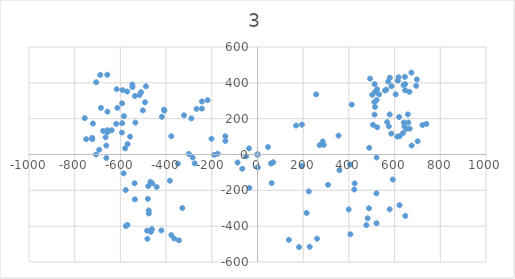
| Category | Series 0 |
|---|---|
| 0.0 | 0 |
| -243.16000000000008 | 296.004 |
| -243.16000000000008 | 256.11 |
| -289.60400000000004 | 201.331 |
| -283.947 | -16.747 |
| -468.68000000000006 | -152.506 |
| -328.75300000000004 | -298.982 |
| -466.29900000000004 | -431.764 |
| -420.45000000000005 | -424.023 |
| -343.639 | -478.803 |
| 137.173 | -476.421 |
| 228.2739999999999 | -515.125 |
| 476.27199999999993 | -393.954 |
| 520.9299999999998 | -383.832 |
| 224.404 | -206.095 |
| 168.731 | 161.585 |
| 194.18599999999992 | 166.498 |
| 489.07399999999984 | 37.438 |
| 354.50599999999986 | 105.317 |
| -66.61400000000003 | -79.565 |
| -50.09100000000001 | -9.453 |
| -383.533 | -146.254 |
| -537.751 | -160.544 |
| 308.9559999999999 | -169.178 |
| 398.866 | -306.723 |
| -476.27200000000005 | -312.231 |
| 621.558 | -282.757 |
| 647.0129999999999 | -342.598 |
| -661.6010000000001 | -19.129 |
| -706.854 | -0.075 |
| -692.5630000000001 | 26.124 |
| -661.6010000000001 | 49.942 |
| -656.837 | 123.775 |
| -723.5260000000001 | 92.813 |
| -749.725 | 85.668 |
| -592.53 | 285.733 |
| -616.3480000000001 | 364.33 |
| 514.9759999999999 | 350.04 |
| 557.847 | 357.185 |
| 586.4279999999999 | 381.003 |
| 512.594 | 392.911 |
| 572.137 | 407.202 |
| 579.2819999999999 | 428.637 |
| 617.3899999999999 | 431.019 |
| 645.971 | 392.911 |
| 665.0249999999999 | 350.04 |
| 657.8799999999999 | 223.808 |
| 619.7719999999999 | 209.518 |
| 567.374 | 180.937 |
| 660.261 | 178.555 |
| 650.7339999999999 | 142.829 |
| 636.444 | 119.012 |
| 674.5519999999999 | 49.942 |
| 700.751 | 73.759 |
| 722.1859999999999 | 164.265 |
| 622.154 | 102.34 |
| -409.13700000000006 | 250.007 |
| 412.5609999999999 | 278.588 |
| 0.0 | 0 |
| -36.990999999999985 | 34.312 |
| -201.18200000000002 | 87.752 |
| -140.44799999999987 | 75.844 |
| -348.2539999999999 | -50.984 |
| -536.56 | -250.454 |
| -575.858 | -399.312 |
| -482.971 | -424.916 |
| -376.98299999999995 | -449.924 |
| 215.02600000000007 | -326.521 |
| 59.319999999999936 | -50.239 |
| 2.1590000000001055 | -71.675 |
| -87.15599999999995 | -44.881 |
| 481.9290000000001 | -355.994 |
| 578.3890000000001 | -305.978 |
| -475.5279999999999 | -329.2 |
| -568.415 | 58.427 |
| -557.697 | 99.512 |
| -618.4319999999999 | 170.964 |
| -534.476 | 178.109 |
| -584.492 | 213.835 |
| -613.073 | 260.279 |
| -638.0809999999999 | 135.238 |
| -675.593 | 131.665 |
| -720.251 | 172.75 |
| -755.977 | 203.117 |
| -705.9599999999999 | 403.183 |
| -688.097 | 444.268 |
| -570.202 | 351.38 |
| -546.9799999999999 | 376.389 |
| -536.262 | 326.372 |
| -509.467 | 347.808 |
| -218.29999999999995 | 303.15 |
| 505.15100000000007 | 165.605 |
| 574.817 | 156.674 |
| 640.9100000000001 | 178.109 |
| 665.9180000000001 | 144.17 |
| 739.156 | 170.964 |
| 512.296 | 222.767 |
| 514.0830000000001 | 265.638 |
| 521.2280000000001 | 303.15 |
| 531.9460000000001 | 335.304 |
| 646.269 | 358.526 |
| 639.124 | 387.106 |
| 694.499 | 383.534 |
| 0.0 | 0 |
| 487.9060000000002 | -300.204 |
| -275.203 | -49.803 |
| -300.5999999999999 | 2.976 |
| -189.48699999999985 | -1.389 |
| -174.01 | 4.166 |
| 46.09900000000016 | 41.601 |
| -35.384000000000015 | -185.916 |
| 193.721 | -63.692 |
| 271.7650000000001 | 51.918 |
| 289.75400000000013 | 53.506 |
| 285.5210000000002 | 72.554 |
| 358.538 | -87.767 |
| 405.10000000000014 | -56.549 |
| 592.008 | -139.619 |
| 520.5780000000002 | -216.869 |
| 425.33900000000017 | -161.313 |
| 406.55500000000006 | -445.445 |
| 260.5210000000002 | -470.048 |
| 181.9480000000001 | -516.875 |
| -481.6879999999999 | -470.577 |
| -479.8359999999999 | -247.558 |
| -478.2489999999999 | -176.657 |
| -441.2109999999999 | -181.419 |
| -460.2589999999999 | -161.313 |
| -585.6579999999999 | -105.227 |
| -576.6629999999999 | -198.35 |
| -377.18899999999996 | 102.184 |
| -140.6769999999999 | 101.787 |
| 61.708000000000084 | -159.725 |
| 68.85100000000011 | -43.057 |
| -0.1979999999998654 | -71.629 |
| 423.61900000000014 | -195.44 |
| -569.2549999999999 | -393.063 |
| -462.1109999999999 | -416.873 |
| -364.4899999999999 | -469.255 |
| -321.63199999999983 | 218.853 |
| -266.8689999999999 | 254.567 |
| 521.24 | -16.866 |
| 611.7170000000001 | 99.803 |
| 585.527 | 116.47 |
| 523.6210000000001 | 152.185 |
| 642.6700000000001 | 156.947 |
| 578.384 | 223.615 |
| 604.5740000000001 | 335.521 |
| 511.7160000000001 | 292.663 |
| 502.192 | 333.14 |
| 523.6210000000001 | 364.093 |
| 564.0980000000002 | 361.712 |
| 256.94900000000007 | 335.521 |
| 492.6680000000001 | 423.618 |
| 614.0980000000002 | 411.713 |
| 645.0510000000002 | 433.142 |
| 697.433 | 418.856 |
| 673.623 | 456.952 |
| -657.3519999999999 | 445.047 |
| -590.6839999999999 | 359.331 |
| -547.8269999999999 | 390.284 |
| -488.3019999999999 | 380.76 |
| -516.0799999999999 | 331.95 |
| -492.26999999999987 | 291.473 |
| -685.1299999999999 | 260.52 |
| -656.5589999999999 | 239.091 |
| -418.45899999999995 | 210.519 |
| -407.7449999999999 | 245.043 |
| -501.79399999999987 | 246.234 |
| -592.2719999999999 | 174.804 |
| -593.4619999999999 | 122.422 |
| -656.5589999999999 | 135.518 |
| -664.8919999999999 | 96.231 |
| -723.2259999999999 | 85.517 |
| -579.1759999999999 | 34.326 |